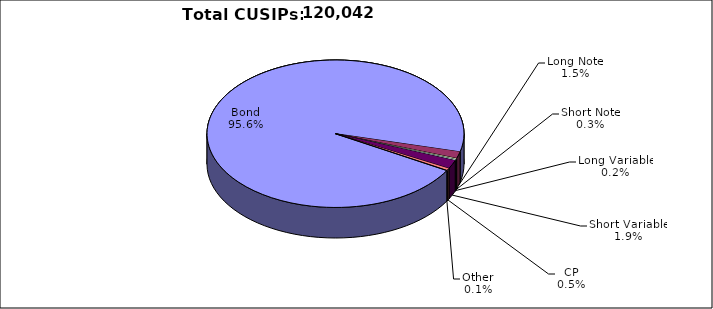
| Category | CUSIPs |
|---|---|
| Bond | 114788 |
| Long Note | 1772 |
| Short Note | 309 |
| Long Variable | 275 |
| Short Variable | 2261 |
| CP | 571 |
| Other | 66 |